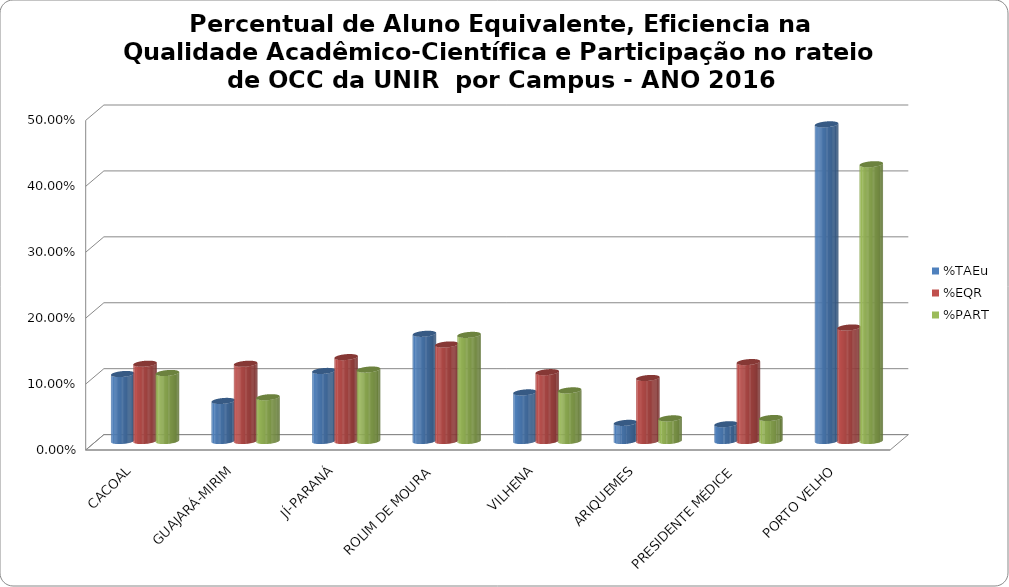
| Category | %TAEu | %EQR | %PART |
|---|---|---|---|
| CACOAL | 0.102 | 0.117 | 0.103 |
| GUAJARÁ-MIRIM | 0.061 | 0.117 | 0.066 |
| JÍ-PARANÁ | 0.106 | 0.127 | 0.108 |
| ROLIM DE MOURA | 0.163 | 0.146 | 0.161 |
| VILHENA | 0.074 | 0.104 | 0.077 |
| ARIQUEMES | 0.028 | 0.096 | 0.034 |
| PRESIDENTE MÉDICE | 0.025 | 0.12 | 0.035 |
| PORTO VELHO | 0.48 | 0.172 | 0.42 |